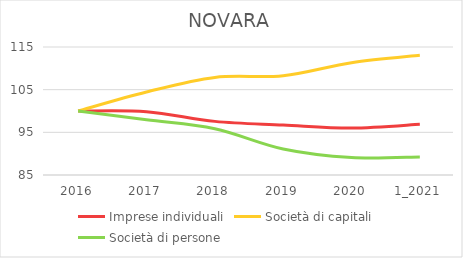
| Category | Imprese individuali | Società di capitali | Società di persone |
|---|---|---|---|
| 2016 | 100 | 100 | 100 |
| 2017 | 99.85 | 104.449 | 97.932 |
| 2018 | 97.57 | 107.872 | 95.841 |
| 2019 | 96.716 | 108.276 | 91.101 |
| 2020 | 95.994 | 111.325 | 89.103 |
| 1_2021 | 96.866 | 113.052 | 89.243 |